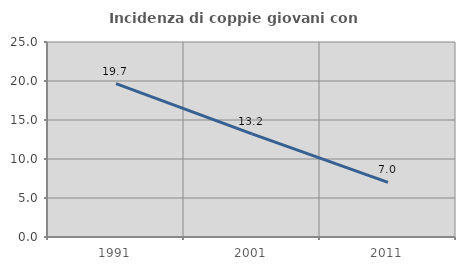
| Category | Incidenza di coppie giovani con figli |
|---|---|
| 1991.0 | 19.654 |
| 2001.0 | 13.225 |
| 2011.0 | 6.995 |